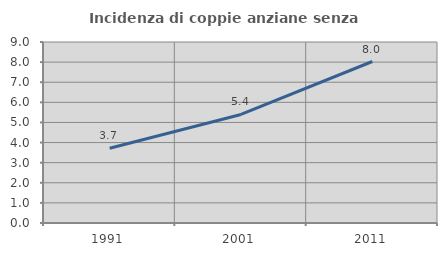
| Category | Incidenza di coppie anziane senza figli  |
|---|---|
| 1991.0 | 3.718 |
| 2001.0 | 5.396 |
| 2011.0 | 8.03 |